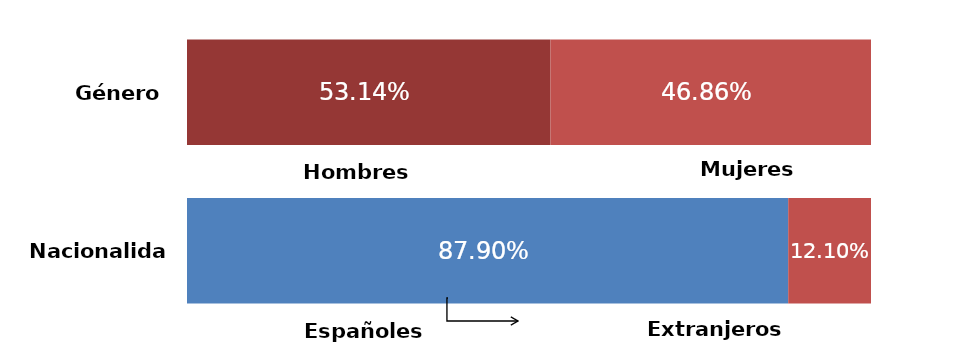
| Category | Series 0 | Series 1 |
|---|---|---|
| 0 | 0.531 | 0.469 |
| 1 | 0.879 | 0.121 |